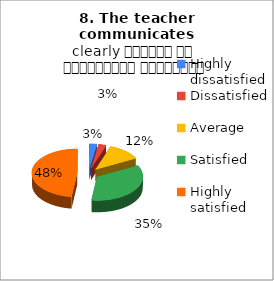
| Category | 8. The teacher communicates clearly शिक्षक का सम्प्रेषण सुस्पष्ट है |
|---|---|
| Highly dissatisfied | 2 |
| Dissatisfied | 2 |
| Average | 9 |
| Satisfied | 26 |
| Highly satisfied | 36 |